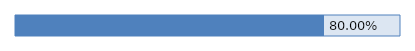
| Category | Series 0 |
|---|---|
| 0 | 0.8 |